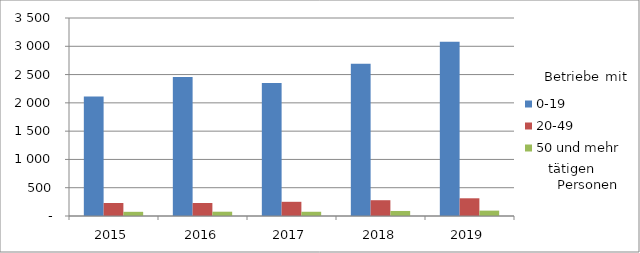
| Category | 0-19 | 20-49 | 50 und mehr |
|---|---|---|---|
| 2015.0 | 2111 | 230 | 74 |
| 2016.0 | 2456 | 230 | 76 |
| 2017.0 | 2350 | 251 | 75 |
| 2018.0 | 2691 | 279 | 89 |
| 2019.0 | 3080 | 313 | 95 |